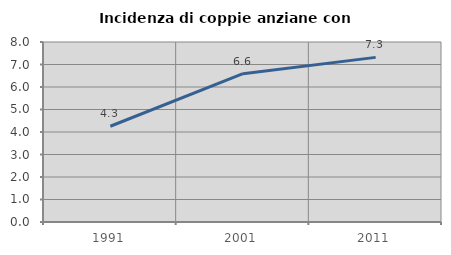
| Category | Incidenza di coppie anziane con figli |
|---|---|
| 1991.0 | 4.255 |
| 2001.0 | 6.593 |
| 2011.0 | 7.317 |